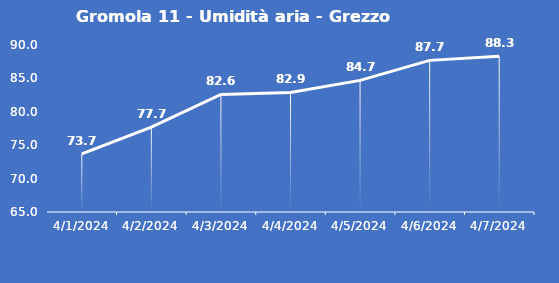
| Category | Gromola 11 - Umidità aria - Grezzo (%) |
|---|---|
| 4/1/24 | 73.7 |
| 4/2/24 | 77.7 |
| 4/3/24 | 82.6 |
| 4/4/24 | 82.9 |
| 4/5/24 | 84.7 |
| 4/6/24 | 87.7 |
| 4/7/24 | 88.3 |